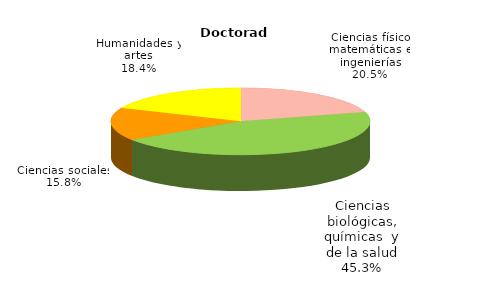
| Category | Series 0 |
|---|---|
| Ciencias físico matemáticas e ingenierías | 1089 |
| Ciencias biológicas, químicas y de la salud | 2404 |
| Ciencias sociales | 841 |
| Humanidades y artes | 979 |